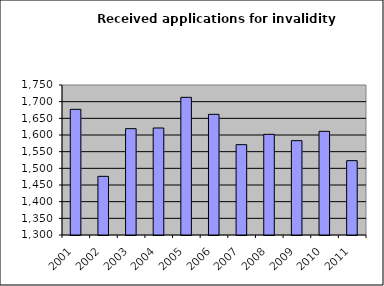
| Category | Series 1 |
|---|---|
| 2001.0 | 1677 |
| 2002.0 | 1476 |
| 2003.0 | 1619 |
| 2004.0 | 1621 |
| 2005.0 | 1713 |
| 2006.0 | 1662 |
| 2007.0 | 1571 |
| 2008.0 | 1602 |
| 2009.0 | 1583 |
| 2010.0 | 1611 |
| 2011.0 | 1523 |